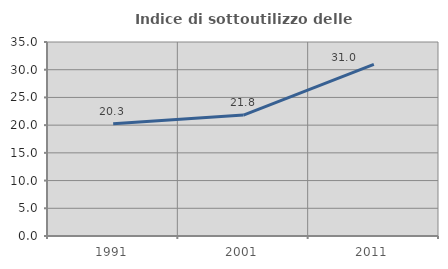
| Category | Indice di sottoutilizzo delle abitazioni  |
|---|---|
| 1991.0 | 20.264 |
| 2001.0 | 21.811 |
| 2011.0 | 30.98 |